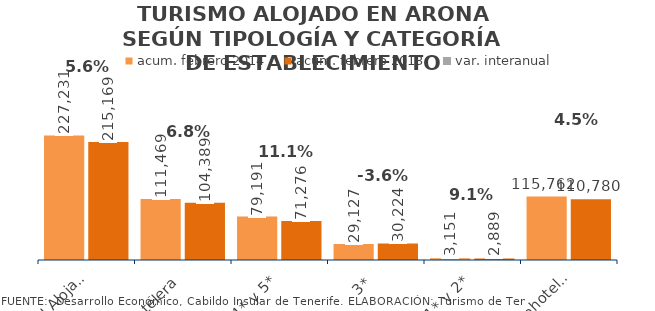
| Category | acum. febrero 2014 | acum. febrero 2013 |
|---|---|---|
| Total Alojados | 227231 | 215169 |
| Hotelera | 111469 | 104389 |
| 4* y 5* | 79191 | 71276 |
| 3* | 29127 | 30224 |
| 1* y 2* | 3151 | 2889 |
| Extrahotelera | 115762 | 110780 |